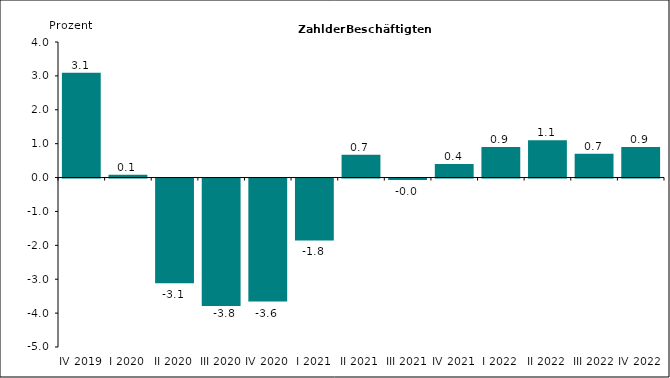
| Category | Series 0 |
|---|---|
| IV 2019 | 3.093 |
| I 2020 | 0.085 |
| II 2020 | -3.091 |
| III 2020 | -3.759 |
| IV 2020 | -3.628 |
| I 2021 | -1.825 |
| II 2021 | 0.67 |
| III 2021 | -0.044 |
| IV 2021 | 0.4 |
| I 2022 | 0.9 |
| II 2022 | 1.1 |
| III 2022 | 0.7 |
| IV 2022 | 0.9 |